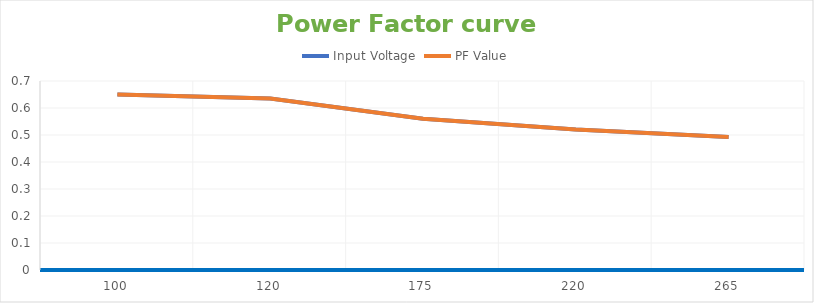
| Category | Input Voltage | PF Value |
|---|---|---|
| 100.0 | 0.65 | 0.65 |
| 120.0 | 0.635 | 0.635 |
| 175.0 | 0.56 | 0.56 |
| 220.0 | 0.52 | 0.52 |
| 265.0 | 0.493 | 0.493 |